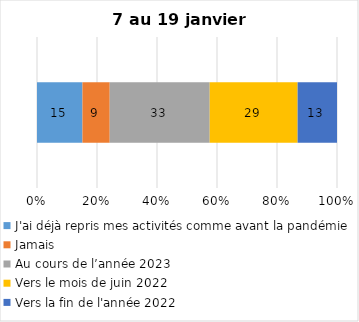
| Category | J'ai déjà repris mes activités comme avant la pandémie | Jamais | Au cours de l’année 2023 | Vers le mois de juin 2022 | Vers la fin de l'année 2022 |
|---|---|---|---|---|---|
| 0 | 15 | 9 | 33 | 29 | 13 |